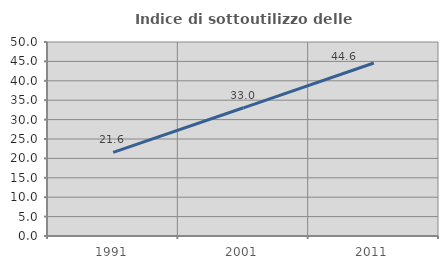
| Category | Indice di sottoutilizzo delle abitazioni  |
|---|---|
| 1991.0 | 21.57 |
| 2001.0 | 33.043 |
| 2011.0 | 44.577 |